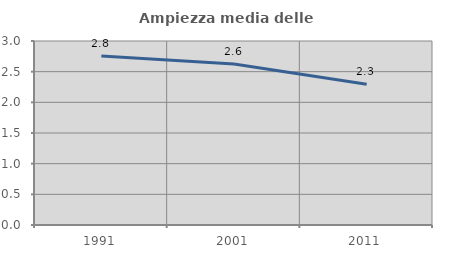
| Category | Ampiezza media delle famiglie |
|---|---|
| 1991.0 | 2.756 |
| 2001.0 | 2.625 |
| 2011.0 | 2.295 |